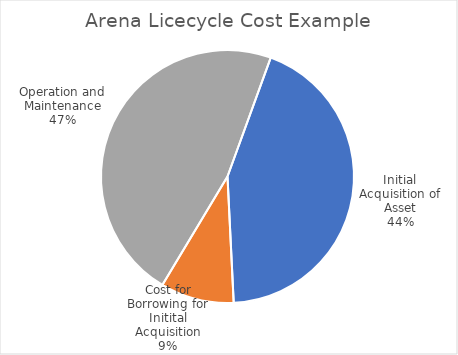
| Category | Series 0 |
|---|---|
| Initial Acquisition of Asset | 186000 |
| Cost for Borrowing for Initital Acquisition | 40000 |
| Operation and Maintenance | 200000 |